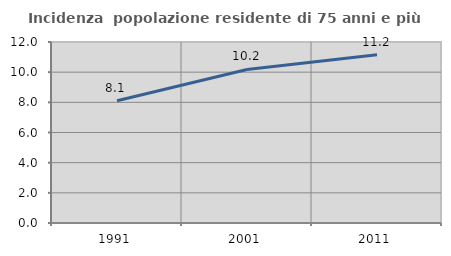
| Category | Incidenza  popolazione residente di 75 anni e più |
|---|---|
| 1991.0 | 8.105 |
| 2001.0 | 10.178 |
| 2011.0 | 11.152 |